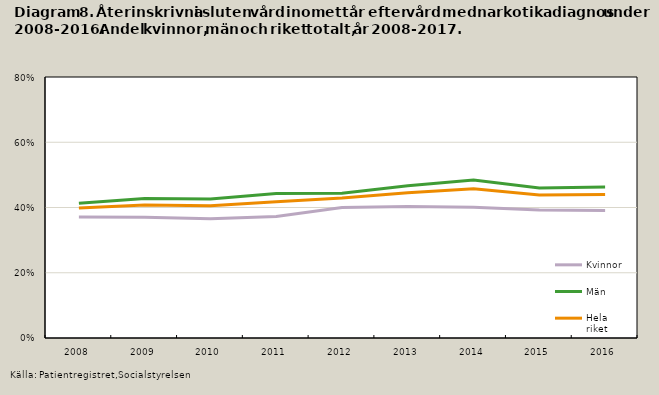
| Category | Kvinnor | Män | Hela riket |
|---|---|---|---|
| 2008.0 | 0.371 | 0.413 | 0.398 |
| 2009.0 | 0.37 | 0.428 | 0.408 |
| 2010.0 | 0.366 | 0.426 | 0.405 |
| 2011.0 | 0.372 | 0.443 | 0.418 |
| 2012.0 | 0.4 | 0.444 | 0.429 |
| 2013.0 | 0.403 | 0.467 | 0.445 |
| 2014.0 | 0.401 | 0.485 | 0.457 |
| 2015.0 | 0.392 | 0.46 | 0.438 |
| 2016.0 | 0.391 | 0.463 | 0.44 |